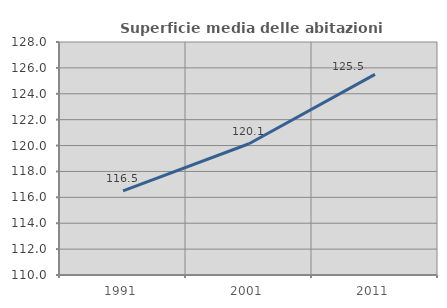
| Category | Superficie media delle abitazioni occupate |
|---|---|
| 1991.0 | 116.495 |
| 2001.0 | 120.14 |
| 2011.0 | 125.5 |